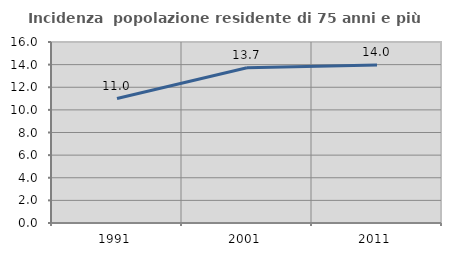
| Category | Incidenza  popolazione residente di 75 anni e più |
|---|---|
| 1991.0 | 10.999 |
| 2001.0 | 13.722 |
| 2011.0 | 13.962 |